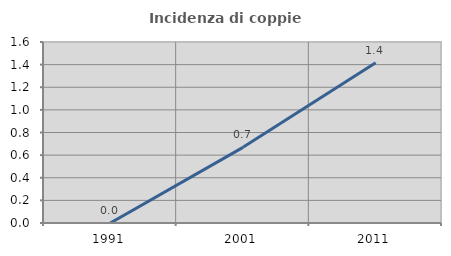
| Category | Incidenza di coppie miste |
|---|---|
| 1991.0 | 0 |
| 2001.0 | 0.669 |
| 2011.0 | 1.416 |